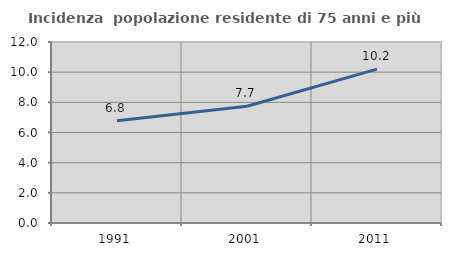
| Category | Incidenza  popolazione residente di 75 anni e più |
|---|---|
| 1991.0 | 6.778 |
| 2001.0 | 7.741 |
| 2011.0 | 10.198 |